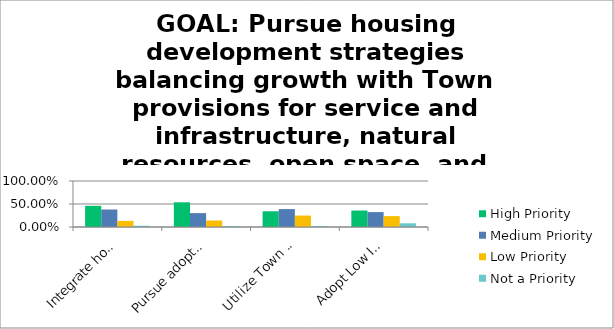
| Category | High Priority | Medium Priority | Low Priority | Not a Priority |
|---|---|---|---|---|
| Integrate housing development with the Town’s Open Space and Recreation Plan (OSRP) to ensure protection of the Town’s priority open space properties. | 0.46 | 0.38 | 0.133 | 0.027 |
| Pursue adoption of Open Space Residential Development Zoning Bylaw to better protect open space, natural resources and scenic vistas. | 0.537 | 0.302 | 0.141 | 0.02 |
| Utilize Town resources to meet local needs, understanding and educating the public about the Community Preservation Act and its possible uses. | 0.342 | 0.389 | 0.248 | 0.02 |
| Adopt Low Impact Development standards for all new residential developments. | 0.358 | 0.324 | 0.236 | 0.081 |